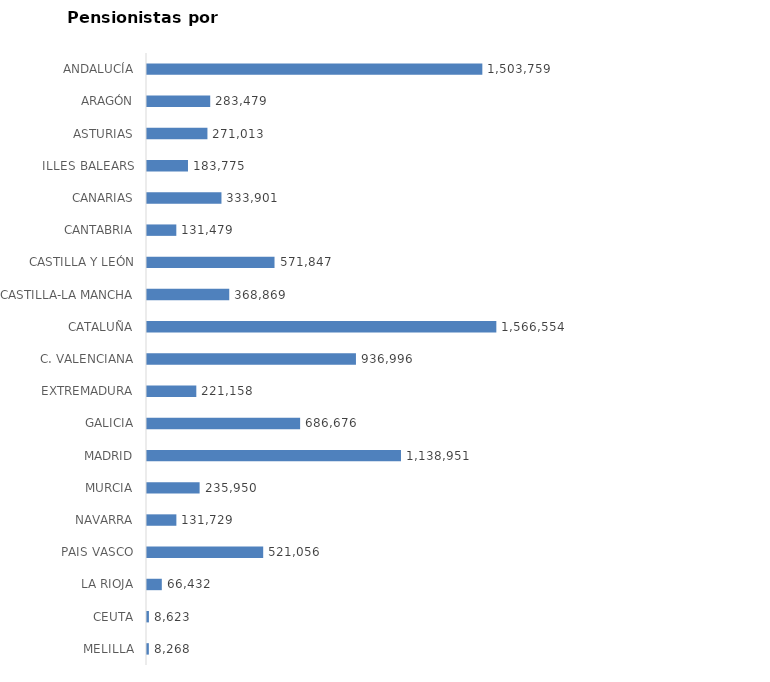
| Category | AMBOS SEXOS (1) |
|---|---|
| ANDALUCÍA | 1503759 |
| ARAGÓN | 283479 |
| ASTURIAS | 271013 |
| ILLES BALEARS | 183775 |
| CANARIAS | 333901 |
| CANTABRIA | 131479 |
| CASTILLA Y LEÓN | 571847 |
| CASTILLA-LA MANCHA | 368869 |
| CATALUÑA | 1566554 |
| C. VALENCIANA | 936996 |
| EXTREMADURA | 221158 |
| GALICIA | 686676 |
| MADRID | 1138951 |
| MURCIA | 235950 |
| NAVARRA | 131729 |
| PAIS VASCO | 521056 |
| LA RIOJA | 66432 |
| CEUTA | 8623 |
| MELILLA | 8268 |